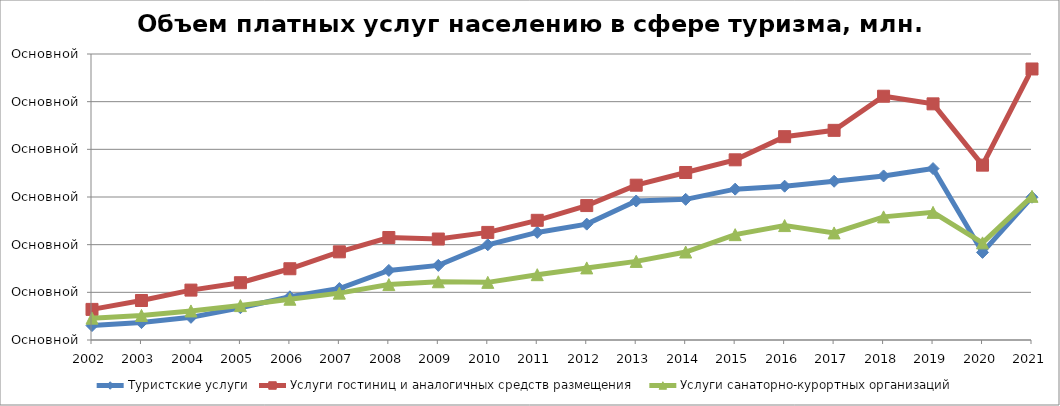
| Category | Туристские услуги | Услуги гостиниц и аналогичных средств размещения | Услуги санаторно-курортных организаций |
|---|---|---|---|
| 2002.0 | 15156.784 | 32103.639 | 22902.027 |
| 2003.0 | 18251.163 | 41429.807 | 25770.583 |
| 2004.0 | 23766.615 | 52341.684 | 30469.24 |
| 2005.0 | 33848.803 | 60098.124 | 36082.437 |
| 2006.0 | 45312.019 | 74743.723 | 42765.604 |
| 2007.0 | 53960.576 | 92479.57 | 49158.453 |
| 2008.0 | 72975.461 | 107521.663 | 58124.687 |
| 2009.0 | 78227.59 | 105903.557 | 61090.111 |
| 2010.0 | 99879 | 112855 | 60460 |
| 2011.0 | 112829 | 125541 | 68521 |
| 2012.0 | 121545 | 141012 | 75622 |
| 2013.0 | 145784 | 162387 | 82444 |
| 2014.0 | 147541 | 175709 | 92300 |
| 2015.0 | 158252 | 188992 | 110513 |
| 2016.0 | 161344 | 213288 | 120009 |
| 2017.0 | 166520 | 219916 | 112305 |
| 2018.0 | 172090 | 255708 | 129147 |
| 2019.0 | 179826 | 247702 | 133873 |
| 2020.0 | 91884 | 183407 | 101882 |
| 2021.0 | 149751 | 284288 | 150678 |